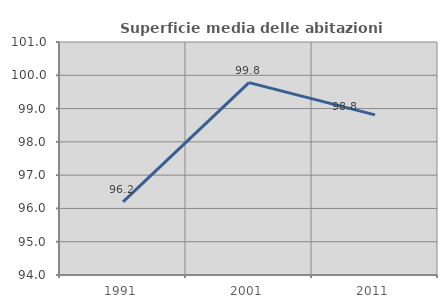
| Category | Superficie media delle abitazioni occupate |
|---|---|
| 1991.0 | 96.198 |
| 2001.0 | 99.781 |
| 2011.0 | 98.81 |